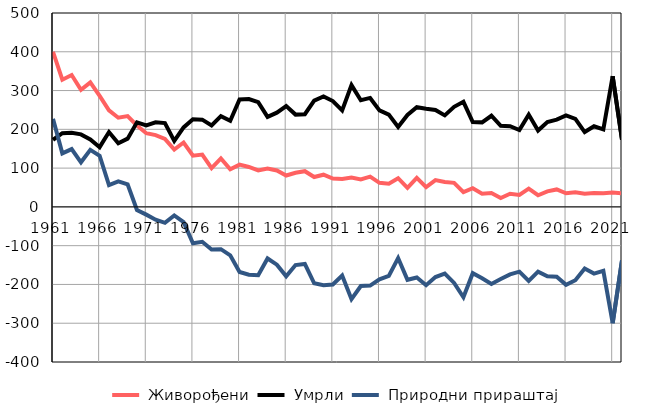
| Category |  Живорођени |  Умрли |  Природни прираштај |
|---|---|---|---|
| 1961.0 | 400 | 173 | 227 |
| 1962.0 | 328 | 190 | 138 |
| 1963.0 | 340 | 191 | 149 |
| 1964.0 | 302 | 187 | 115 |
| 1965.0 | 321 | 174 | 147 |
| 1966.0 | 286 | 154 | 132 |
| 1967.0 | 249 | 193 | 56 |
| 1968.0 | 230 | 164 | 66 |
| 1969.0 | 234 | 176 | 58 |
| 1970.0 | 210 | 218 | -8 |
| 1971.0 | 190 | 210 | -20 |
| 1972.0 | 185 | 218 | -33 |
| 1973.0 | 175 | 216 | -41 |
| 1974.0 | 148 | 170 | -22 |
| 1975.0 | 166 | 205 | -39 |
| 1976.0 | 132 | 226 | -94 |
| 1977.0 | 135 | 225 | -90 |
| 1978.0 | 100 | 210 | -110 |
| 1979.0 | 125 | 234 | -109 |
| 1980.0 | 97 | 222 | -125 |
| 1981.0 | 109 | 277 | -168 |
| 1982.0 | 103 | 278 | -175 |
| 1983.0 | 94 | 270 | -176 |
| 1984.0 | 99 | 232 | -133 |
| 1985.0 | 94 | 243 | -149 |
| 1986.0 | 81 | 260 | -179 |
| 1987.0 | 88 | 238 | -150 |
| 1988.0 | 92 | 239 | -147 |
| 1989.0 | 77 | 274 | -197 |
| 1990.0 | 83 | 285 | -202 |
| 1991.0 | 73 | 273 | -200 |
| 1992.0 | 72 | 249 | -177 |
| 1993.0 | 76 | 314 | -238 |
| 1994.0 | 71 | 275 | -204 |
| 1995.0 | 78 | 281 | -203 |
| 1996.0 | 62 | 249 | -187 |
| 1997.0 | 60 | 238 | -178 |
| 1998.0 | 74 | 206 | -132 |
| 1999.0 | 49 | 237 | -188 |
| 2000.0 | 75 | 257 | -182 |
| 2001.0 | 51 | 253 | -202 |
| 2002.0 | 69 | 250 | -181 |
| 2003.0 | 64 | 236 | -172 |
| 2004.0 | 62 | 258 | -196 |
| 2005.0 | 38 | 271 | -233 |
| 2006.0 | 48 | 219 | -171 |
| 2007.0 | 34 | 218 | -184 |
| 2008.0 | 36 | 235 | -199 |
| 2009.0 | 23 | 209 | -186 |
| 2010.0 | 34 | 208 | -174 |
| 2011.0 | 31 | 198 | -167 |
| 2012.0 | 47 | 238 | -191 |
| 2013.0 | 30 | 197 | -167 |
| 2014.0 | 40 | 219 | -179 |
| 2015.0 | 45 | 225 | -180 |
| 2016.0 | 35 | 236 | -201 |
| 2017.0 | 38 | 227 | -189 |
| 2018.0 | 34 | 193 | -159 |
| 2019.0 | 36 | 208 | -172 |
| 2020.0 | 35 | 200 | -165 |
| 2021.0 | 37 | 337 | -300 |
| 2022.0 | 35 | 173 | -138 |